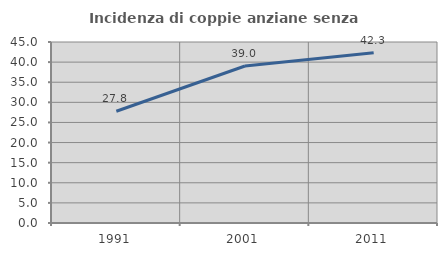
| Category | Incidenza di coppie anziane senza figli  |
|---|---|
| 1991.0 | 27.778 |
| 2001.0 | 39.024 |
| 2011.0 | 42.308 |